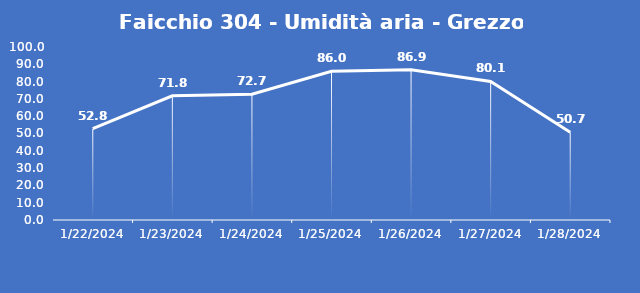
| Category | Faicchio 304 - Umidità aria - Grezzo (%) |
|---|---|
| 1/22/24 | 52.8 |
| 1/23/24 | 71.8 |
| 1/24/24 | 72.7 |
| 1/25/24 | 86 |
| 1/26/24 | 86.9 |
| 1/27/24 | 80.1 |
| 1/28/24 | 50.7 |